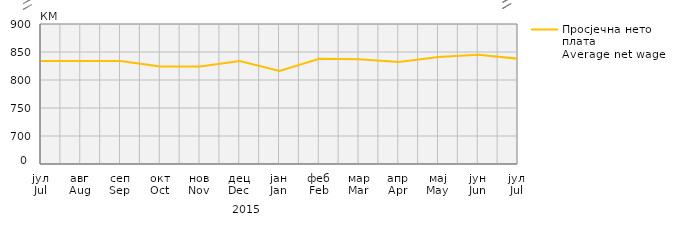
| Category | Просјечна нето плата
Average net wage |
|---|---|
| јул
Jul | 834 |
| авг
Aug | 834 |
| сеп
Sep | 834 |
| окт
Oct | 824 |
| нов
Nov | 824 |
| дец
Dec | 834 |
| јан
Jan | 816 |
| феб
Feb | 838 |
| мар
Mar | 837 |
| апр
Apr | 832 |
| мај
May | 841 |
| јун
Jun | 845 |
| јул
Jul | 838 |